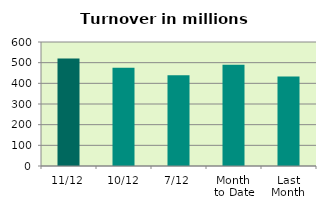
| Category | Series 0 |
|---|---|
| 11/12 | 519.666 |
| 10/12 | 475.155 |
| 7/12 | 438.838 |
| Month 
to Date | 490.144 |
| Last
Month | 433.001 |